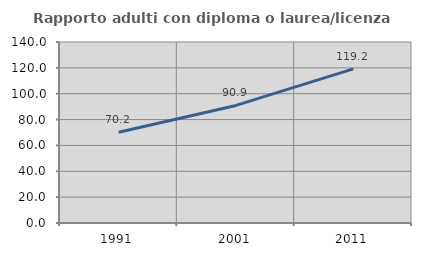
| Category | Rapporto adulti con diploma o laurea/licenza media  |
|---|---|
| 1991.0 | 70.234 |
| 2001.0 | 90.941 |
| 2011.0 | 119.193 |